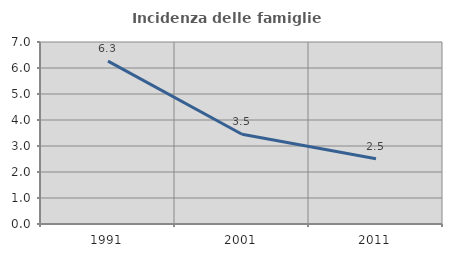
| Category | Incidenza delle famiglie numerose |
|---|---|
| 1991.0 | 6.267 |
| 2001.0 | 3.451 |
| 2011.0 | 2.506 |